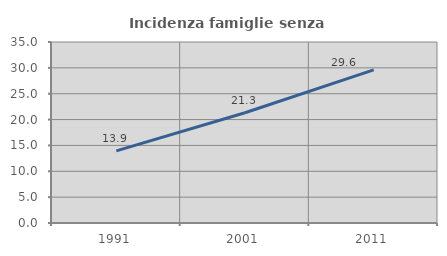
| Category | Incidenza famiglie senza nuclei |
|---|---|
| 1991.0 | 13.94 |
| 2001.0 | 21.311 |
| 2011.0 | 29.597 |